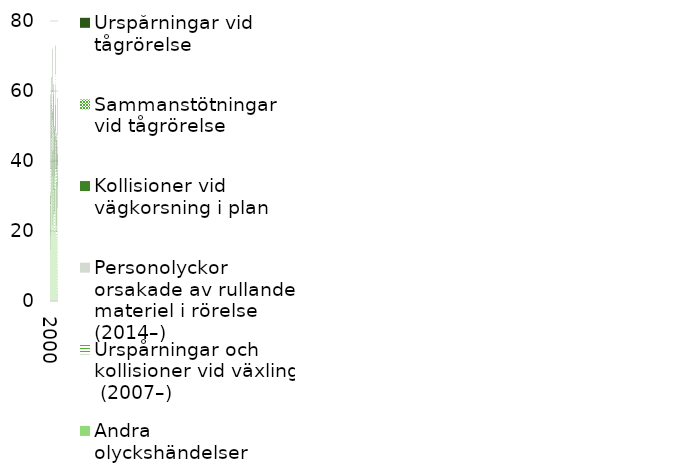
| Category | Andra olyckshändelser | Urspårningar och kollisioner vid växling  (2007–) | Personolyckor orsakade av rullande materiel i rörelse (2014–) | Kollisioner vid vägkorsning i plan | Sammanstötningar vid tågrörelse  | Urspårningar vid tågrörelse  |
|---|---|---|---|---|---|---|
| 2000.0 | 15 | 0 | 0 | 12 | 1 | 2 |
| 2001.0 | 19 | 0 | 0 | 12 | 7 | 21 |
| 2002.0 | 30 | 0 | 0 | 10 | 7 | 9 |
| 2003.0 | 38 | 0 | 0 | 10 | 8 | 8 |
| 2004.0 | 36 | 0 | 0 | 19 | 5 | 12 |
| 2005.0 | 22 | 0 | 0 | 21 | 9 | 2 |
| 2006.0 | 25 | 0 | 0 | 18 | 7 | 12 |
| 2007.0 | 26 | 6 | 0 | 15 | 1 | 11 |
| 2008.0 | 20 | 6 | 0 | 6 | 4 | 14 |
| 2009.0 | 21 | 4 | 0 | 16 | 1 | 7 |
| 2010.0 | 41 | 5 | 0 | 16 | 3 | 8 |
| 2011.0 | 32 | 6 | 0 | 9 | 2 | 7 |
| 2012.0 | 18 | 4 | 0 | 12 | 4 | 10 |
| 2013.0 | 19 | 1 | 0 | 14 | 3 | 9 |
| 2014.0 | 9 | 5 | 19 | 11 | 4 | 10 |
| 2015.0 | 2 | 7 | 18 | 9 | 3 | 3 |